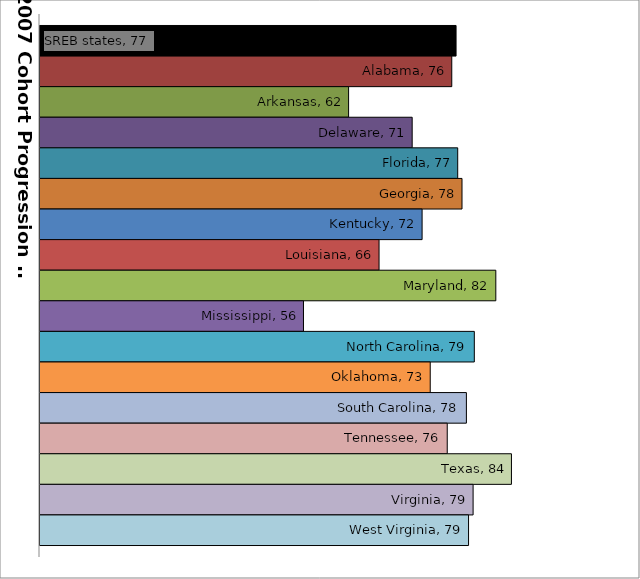
| Category | SREB states | Alabama | Arkansas | Delaware | Florida | Georgia | Kentucky | Louisiana | Maryland | Mississippi | North Carolina | Oklahoma | South Carolina | Tennessee | Texas | Virginia | West Virginia |
|---|---|---|---|---|---|---|---|---|---|---|---|---|---|---|---|---|---|
| 0 | 76.898 | 76.312 | 62.202 | 70.896 | 77.123 | 77.711 | 72.253 | 66.367 | 82.334 | 56.031 | 79.394 | 73.365 | 78.311 | 75.691 | 84.472 | 79.228 | 78.606 |